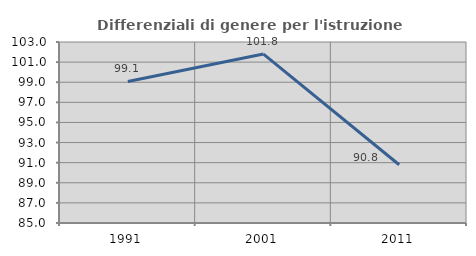
| Category | Differenziali di genere per l'istruzione superiore |
|---|---|
| 1991.0 | 99.076 |
| 2001.0 | 101.799 |
| 2011.0 | 90.794 |